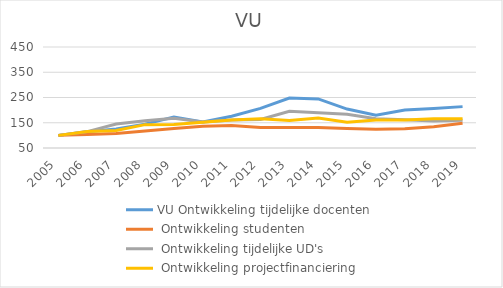
| Category | VU |
|---|---|
| 2005.0 | 100 |
| 2006.0 | 114.867 |
| 2007.0 | 119.469 |
| 2008.0 | 142.478 |
| 2009.0 | 142.655 |
| 2010.0 | 152.035 |
| 2011.0 | 161.062 |
| 2012.0 | 165.841 |
| 2013.0 | 158.442 |
| 2014.0 | 168.412 |
| 2015.0 | 151.947 |
| 2016.0 | 160.476 |
| 2017.0 | 160.83 |
| 2018.0 | 165.719 |
| 2019.0 | 165.476 |